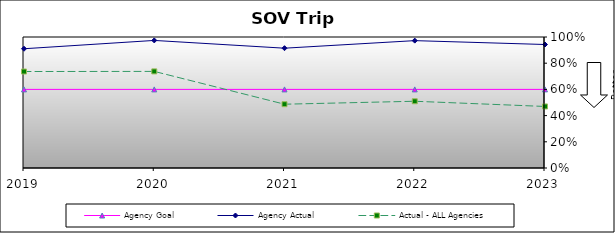
| Category | Agency Goal | Agency Actual | Actual - ALL Agencies |
|---|---|---|---|
| 2019.0 | 0.6 | 0.91 | 0.736 |
| 2020.0 | 0.6 | 0.974 | 0.737 |
| 2021.0 | 0.6 | 0.914 | 0.487 |
| 2022.0 | 0.6 | 0.972 | 0.509 |
| 2023.0 | 0.6 | 0.943 | 0.47 |